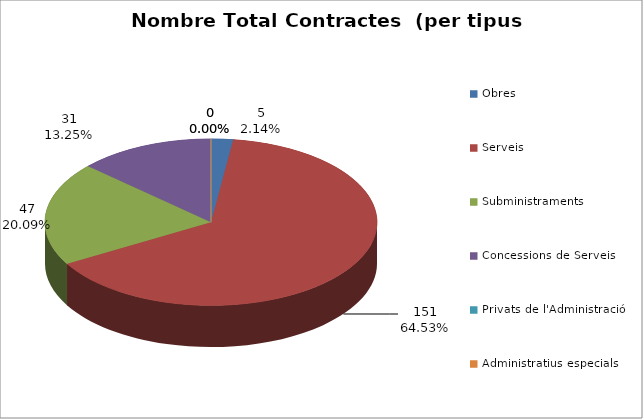
| Category | Nombre Total Contractes |
|---|---|
| Obres | 5 |
| Serveis | 151 |
| Subministraments | 47 |
| Concessions de Serveis | 31 |
| Privats de l'Administració | 0 |
| Administratius especials | 0 |